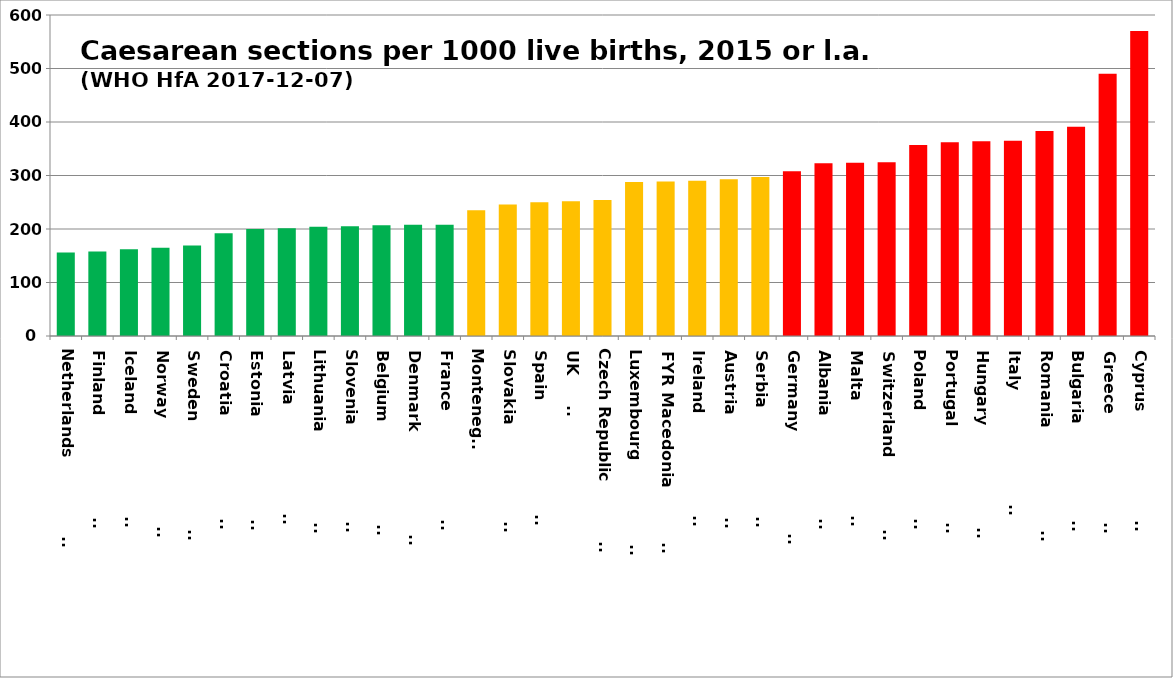
| Category | Series 0 |
|---|---|
| Netherlands                   | 156 |
| Finland                       | 158 |
| Iceland                       | 162 |
| Norway                        | 165 |
| Sweden                        | 169 |
| Croatia                       | 192 |
| Estonia                       | 200 |
| Latvia                        | 201.3 |
| Lithuania                     | 204 |
| Slovenia                      | 205 |
| Belgium                       | 207 |
| Denmark                       | 208 |
| France                        | 208 |
| Montenegro | 235 |
| Slovakia                      | 246 |
| Spain                         | 250 |
| UK         | 252 |
| Czech Republic                | 254 |
| Luxembourg                    | 288 |
| FYR Macedonia                | 289 |
| Ireland                       | 290 |
| Austria                       | 293 |
| Serbia                        | 297 |
| Germany                       | 308 |
| Albania                       | 323 |
| Malta                         | 324 |
| Switzerland                   | 325 |
| Poland                        | 357 |
| Portugal                      | 362 |
| Hungary                       | 364 |
| Italy                         | 365 |
| Romania                       | 383 |
| Bulgaria                      | 391 |
| Greece                        | 490 |
| Cyprus                        | 570.3 |